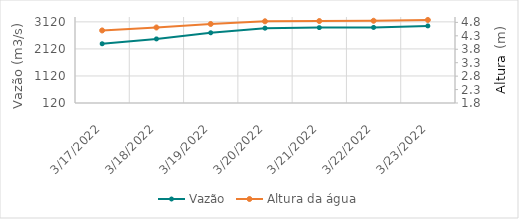
| Category | Vazão |
|---|---|
| 2/23/22 | 1581.85 |
| 2/22/22 | 1735.76 |
| 2/21/22 | 1825 |
| 2/20/22 | 1907.4 |
| 2/19/22 | 1919.8 |
| 2/18/22 | 1795.67 |
| 2/17/22 | 1726.25 |